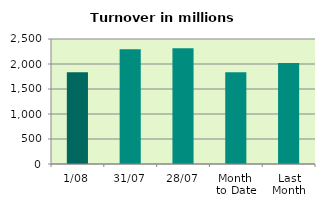
| Category | Series 0 |
|---|---|
| 1/08 | 1833.628 |
| 31/07 | 2297.289 |
| 28/07 | 2316.774 |
| Month 
to Date | 1833.628 |
| Last
Month | 2019.592 |